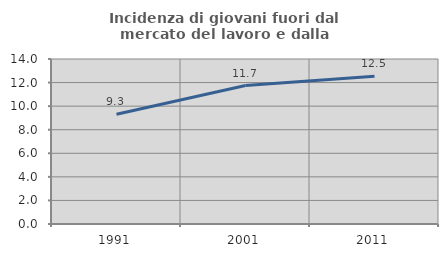
| Category | Incidenza di giovani fuori dal mercato del lavoro e dalla formazione  |
|---|---|
| 1991.0 | 9.309 |
| 2001.0 | 11.745 |
| 2011.0 | 12.528 |